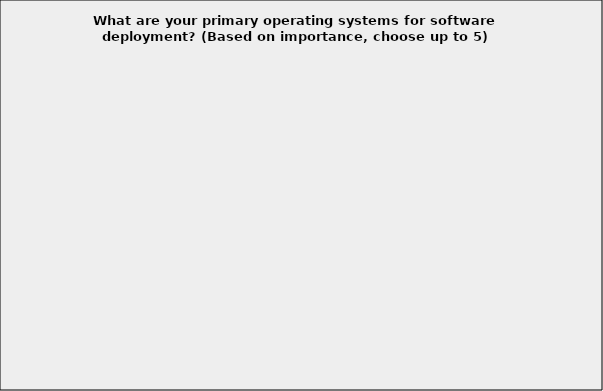
| Category | Series 0 |
|---|---|
| Embedded OS (ex. Embedded Linux, QNX, VxWorks) | 0.061 |
| Linux - Debian | 0.202 |
| Linux - Fedora | 0.061 |
| Linux - RHEL | 0.221 |
| Linux - SUSE | 0.117 |
| Linux - Ubuntu | 0.33 |
| Linux - Other | 0.134 |
| Mac OSX | 0.126 |
| Microsoft Windows (any version of Server or Client) | 0.608 |
| Android | 0.188 |
| Apple iOS | 0.059 |
| Windows Phone | 0.022 |
| Blackberry | 0.009 |
| Oracle Solaris | 0.058 |
| Unix (AIX, HP-UX) | 0.063 |
| Don't know | 0.004 |
| Not Applicable | 0.023 |
| Other (specify) | 0.047 |